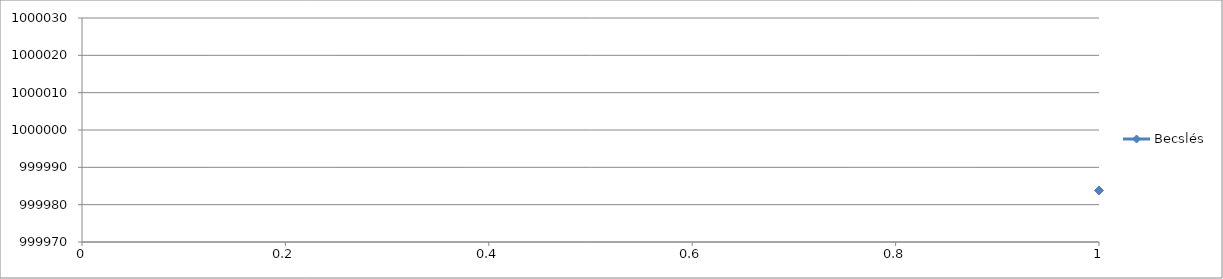
| Category | Becslés |
|---|---|
| 0 | 999983.8 |
| 1 | 999986.3 |
| 2 | 999988.8 |
| 3 | 999987.3 |
| 4 | 999987.8 |
| 5 | 999988.3 |
| 6 | 999980.3 |
| 7 | 999992.8 |
| 8 | 999985.8 |
| 9 | 999985.3 |
| 10 | 999989.8 |
| 11 | 999996.3 |
| 12 | 999985.3 |
| 13 | 999994.3 |
| 14 | 999994.8 |
| 15 | 1000012.3 |
| 16 | 999993.8 |
| 17 | 999990.8 |
| 18 | 1000002.3 |
| 19 | 999991.8 |
| 20 | 1000000.3 |
| 21 | 1000026.8 |
| 22 | 1000025.3 |
| 23 | 1000019.3 |
| 24 | 1000018.8 |
| 25 | 1000005.8 |
| 26 | 1000004.3 |
| 27 | 999988.3 |
| 28 | 999994.8 |
| 29 | 999994.8 |
| 30 | 999993.3 |
| 31 | 1000011.3 |
| 32 | 1000018.8 |
| 33 | 1000012.8 |
| 34 | 1000026.8 |
| 35 | 1000004.3 |
| 36 | 1000002.3 |
| 37 | 999996.3 |
| 38 | 999995.8 |
| 39 | 999999.3 |
| 40 | 999996.8 |
| 41 | 1000008.3 |
| 42 | 1000007.3 |
| 43 | 1000025.3 |
| 44 | 1000025.3 |
| 45 | 1000017.8 |
| 46 | 1000016.8 |
| 47 | 1000003.8 |
| 48 | 999997.3 |
| 49 | 1000003.3 |
| 50 | 999995.8 |
| 51 | 999997.3 |
| 52 | 1000021.3 |
| 53 | 1000026.3 |
| 54 | 1000026.8 |
| 55 | 1000021.3 |
| 56 | 1000014.3 |
| 57 | 999996.3 |
| 58 | 999983.3 |
| 59 | 999976.3 |
| 60 | 999977.3 |
| 61 | 999982.3 |
| 62 | 999990.3 |
| 63 | 1000020.3 |
| 64 | 1000011.3 |
| 65 | 1000024.8 |
| 66 | 1000015.3 |
| 67 | 1000001.8 |
| 68 | 999991.3 |
| 69 | 999988.3 |
| 70 | 999991.8 |
| 71 | 999985.3 |
| 72 | 999984.8 |
| 73 | 1000008.3 |
| 74 | 999993.8 |
| 75 | 999999.8 |
| 76 | 999988.8 |
| 77 | 999994.8 |
| 78 | 1000002.3 |
| 79 | 999991.3 |
| 80 | 999998.3 |
| 81 | 999994.3 |
| 82 | 999996.8 |
| 83 | 999992.8 |
| 84 | 999990.3 |
| 85 | 999989.8 |
| 86 | 999997.3 |
| 87 | 999988.3 |
| 88 | 1000010.3 |
| 89 | 999996.8 |
| 90 | 999994.3 |
| 91 | 999995.3 |
| 92 | 999995.3 |
| 93 | 999995.3 |
| 94 | 1000016.8 |
| 95 | 999996.8 |
| 96 | 1000010.3 |
| 97 | 999998.8 |
| 98 | 1000000.3 |
| 99 | 999976.3 |